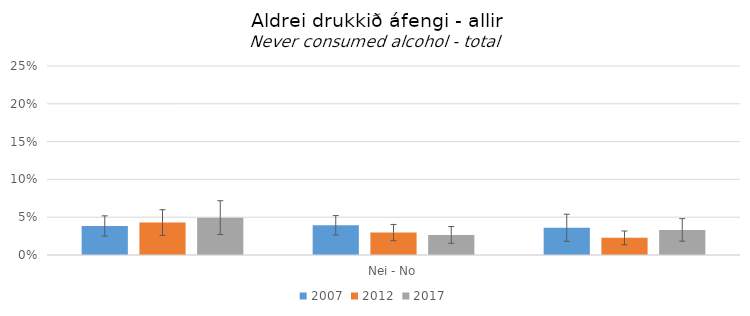
| Category | 2007 | 2012 | 2017 |
|---|---|---|---|
| 0 | 0.038 | 0.043 | 0.049 |
| 1 | 0.039 | 0.03 | 0.027 |
| 2 | 0.036 | 0.023 | 0.033 |